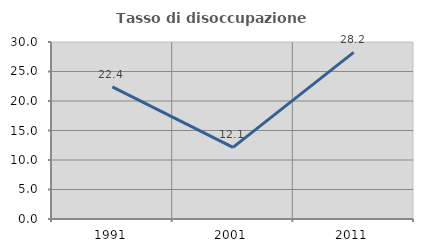
| Category | Tasso di disoccupazione giovanile  |
|---|---|
| 1991.0 | 22.379 |
| 2001.0 | 12.139 |
| 2011.0 | 28.235 |